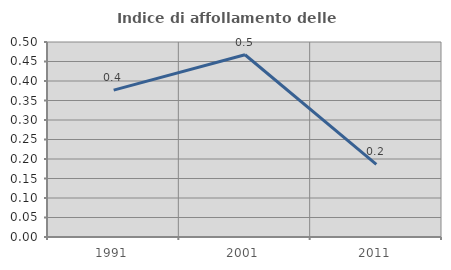
| Category | Indice di affollamento delle abitazioni  |
|---|---|
| 1991.0 | 0.377 |
| 2001.0 | 0.467 |
| 2011.0 | 0.186 |